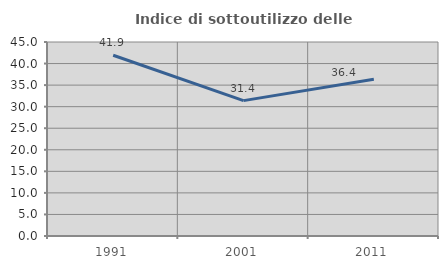
| Category | Indice di sottoutilizzo delle abitazioni  |
|---|---|
| 1991.0 | 41.935 |
| 2001.0 | 31.405 |
| 2011.0 | 36.364 |